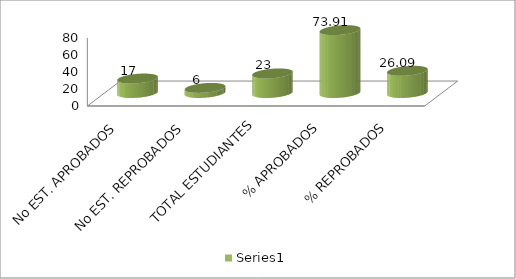
| Category | Series 0 |
|---|---|
| No EST. APROBADOS | 17 |
| No EST. REPROBADOS | 6 |
| TOTAL ESTUDIANTES | 23 |
| % APROBADOS | 73.913 |
| % REPROBADOS | 26.087 |